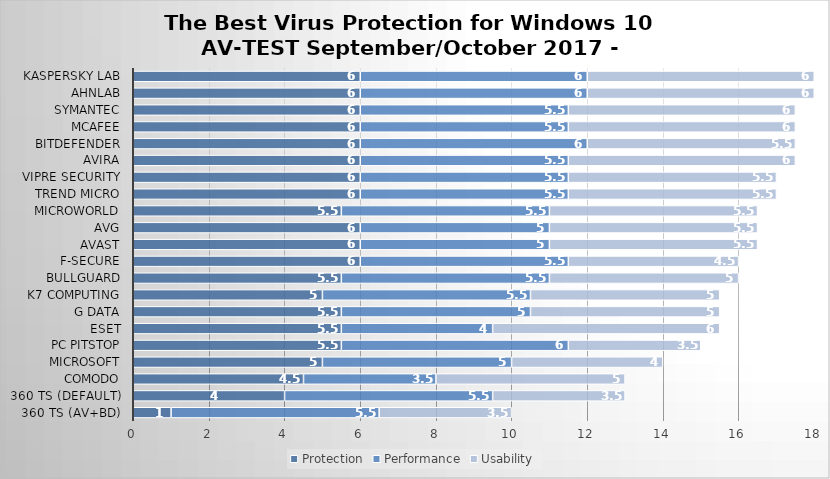
| Category | Protection | Performance | Usability |
|---|---|---|---|
| 360 TS (AV+BD) | 1 | 5.5 | 3.5 |
| 360 TS (Default) | 4 | 5.5 | 3.5 |
| Comodo | 4.5 | 3.5 | 5 |
| Microsoft | 5 | 5 | 4 |
| PC Pitstop | 5.5 | 6 | 3.5 |
| ESET | 5.5 | 4 | 6 |
| G Data | 5.5 | 5 | 5 |
| K7 Computing | 5 | 5.5 | 5 |
| BullGuard | 5.5 | 5.5 | 5 |
| F-Secure | 6 | 5.5 | 4.5 |
| Avast | 6 | 5 | 5.5 |
| AVG | 6 | 5 | 5.5 |
| Microworld | 5.5 | 5.5 | 5.5 |
| Trend Micro | 6 | 5.5 | 5.5 |
| VIPRE Security | 6 | 5.5 | 5.5 |
| Avira | 6 | 5.5 | 6 |
| Bitdefender | 6 | 6 | 5.5 |
| McAfee | 6 | 5.5 | 6 |
| Symantec | 6 | 5.5 | 6 |
| AhnLab | 6 | 6 | 6 |
| Kaspersky Lab | 6 | 6 | 6 |